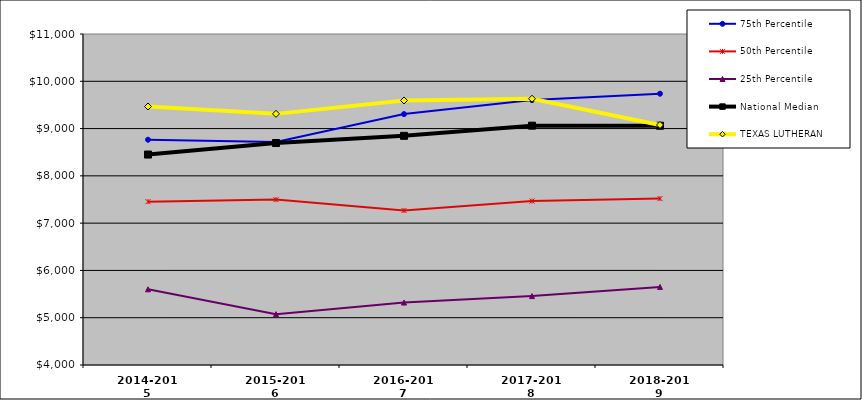
| Category | 75th Percentile | 50th Percentile | 25th Percentile | National Median | TEXAS LUTHERAN |
|---|---|---|---|---|---|
| 2014-2015 | 8763.758 | 7454.534 | 5600.717 | 8450.558 | 9467.017 |
| 2015-2016 | 8715.094 | 7497.462 | 5075.485 | 8693.909 | 9310.984 |
| 2016-2017 | 9305.859 | 7266.428 | 5320.534 | 8846.742 | 9594.193 |
| 2017-2018 | 9602.024 | 7466.982 | 5456.953 | 9061.41 | 9631.144 |
| 2018-2019 | 9737.2 | 7518.898 | 5650.779 | 9059.978 | 9075.626 |